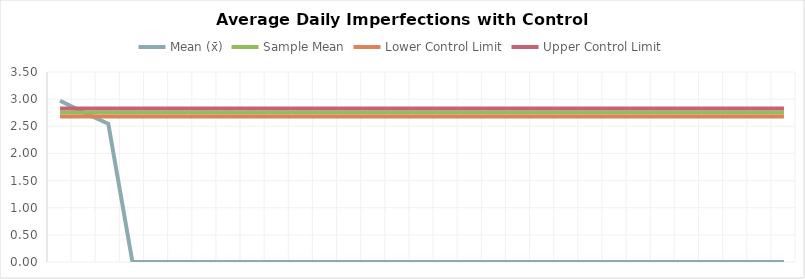
| Category | Mean (x̄) | Sample Mean | Lower Control Limit | Upper Control Limit |
|---|---|---|---|---|
| 0 | 2.97 | 2.756 | 2.682 | 2.83 |
| 1 | 2.752 | 2.756 | 2.682 | 2.83 |
| 2 | 2.546 | 2.756 | 2.682 | 2.83 |
| 3 | 0 | 2.756 | 2.682 | 2.83 |
| 4 | 0 | 2.756 | 2.682 | 2.83 |
| 5 | 0 | 2.756 | 2.682 | 2.83 |
| 6 | 0 | 2.756 | 2.682 | 2.83 |
| 7 | 0 | 2.756 | 2.682 | 2.83 |
| 8 | 0 | 2.756 | 2.682 | 2.83 |
| 9 | 0 | 2.756 | 2.682 | 2.83 |
| 10 | 0 | 2.756 | 2.682 | 2.83 |
| 11 | 0 | 2.756 | 2.682 | 2.83 |
| 12 | 0 | 2.756 | 2.682 | 2.83 |
| 13 | 0 | 2.756 | 2.682 | 2.83 |
| 14 | 0 | 2.756 | 2.682 | 2.83 |
| 15 | 0 | 2.756 | 2.682 | 2.83 |
| 16 | 0 | 2.756 | 2.682 | 2.83 |
| 17 | 0 | 2.756 | 2.682 | 2.83 |
| 18 | 0 | 2.756 | 2.682 | 2.83 |
| 19 | 0 | 2.756 | 2.682 | 2.83 |
| 20 | 0 | 2.756 | 2.682 | 2.83 |
| 21 | 0 | 2.756 | 2.682 | 2.83 |
| 22 | 0 | 2.756 | 2.682 | 2.83 |
| 23 | 0 | 2.756 | 2.682 | 2.83 |
| 24 | 0 | 2.756 | 2.682 | 2.83 |
| 25 | 0 | 2.756 | 2.682 | 2.83 |
| 26 | 0 | 2.756 | 2.682 | 2.83 |
| 27 | 0 | 2.756 | 2.682 | 2.83 |
| 28 | 0 | 2.756 | 2.682 | 2.83 |
| 29 | 0 | 2.756 | 2.682 | 2.83 |
| 30 | 0 | 2.756 | 2.682 | 2.83 |